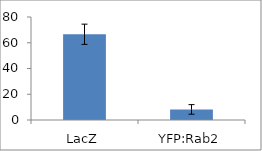
| Category | Series 0 |
|---|---|
| LacZ | 66.597 |
| YFP:Rab2 | 8.217 |